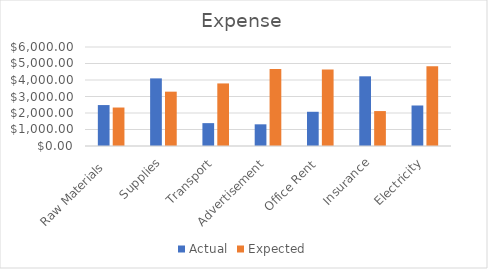
| Category | Actual | Expected |
|---|---|---|
| Raw Materials  | 2481 | 2332 |
| Supplies | 4098 | 3293 |
| Transport | 1386 | 3792 |
| Advertisement | 1314 | 4663 |
| Office Rent | 2074 | 4640 |
| Insurance | 4224 | 2117 |
| Electricity | 2455 | 4829 |